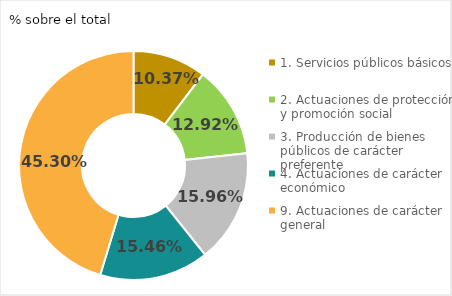
| Category | Series 0 |
|---|---|
| Red local de carreteras | 0.583 |
| Obras y mantenimiento de recintos | 0.126 |
| Vías Azules Barcelona | 0.069 |
| Recursos informáticos | 0.053 |
| Otras inversiones | 0.169 |